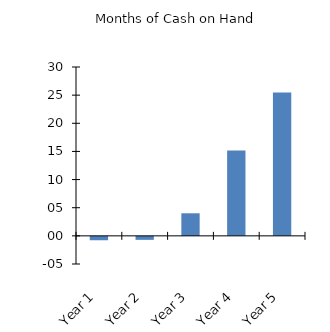
| Category | Months of Cash on Hand |
|---|---|
| 1.0 | -0.779 |
| 2.0 | -0.708 |
| 3.0 | 4.011 |
| 4.0 | 15.16 |
| 5.0 | 25.484 |